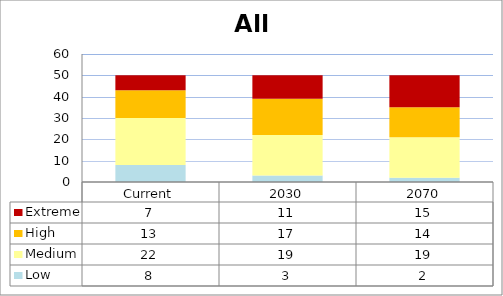
| Category | Low | Medium | High | Extreme |
|---|---|---|---|---|
| Current | 8 | 22 | 13 | 7 |
| 2030 | 3 | 19 | 17 | 11 |
| 2070 | 2 | 19 | 14 | 15 |